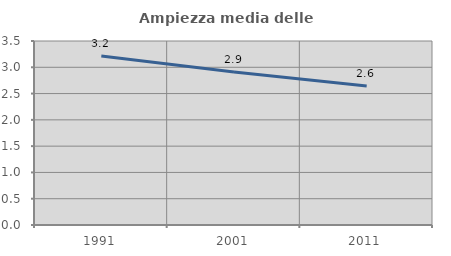
| Category | Ampiezza media delle famiglie |
|---|---|
| 1991.0 | 3.214 |
| 2001.0 | 2.911 |
| 2011.0 | 2.643 |